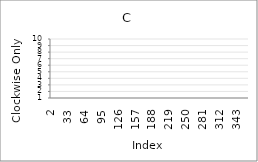
| Category | Series 0 |
|---|---|
| 2.0 | 8 |
| 3.0 | 9 |
| 4.0 | 3 |
| 5.0 | 1 |
| 6.0 | 8 |
| 7.0 | 2 |
| 8.0 | 6 |
| 9.0 | 10 |
| 10.0 | 2 |
| 11.0 | 10 |
| 12.0 | 4 |
| 13.0 | 10 |
| 14.0 | 4 |
| 15.0 | 3 |
| 16.0 | 5 |
| 17.0 | 3 |
| 18.0 | 6 |
| 19.0 | 7 |
| 20.0 | 1 |
| 21.0 | 4 |
| 22.0 | 10 |
| 23.0 | 10 |
| 24.0 | 4 |
| 25.0 | 8 |
| 26.0 | 7 |
| 27.0 | 1 |
| 28.0 | 8 |
| 29.0 | 7 |
| 30.0 | 8 |
| 31.0 | 99 |
| 32.0 | 99 |
| 33.0 | 99 |
| 34.0 | 99 |
| 35.0 | 99 |
| 36.0 | 99 |
| 37.0 | 99 |
| 38.0 | 99 |
| 39.0 | 99 |
| 40.0 | 99 |
| 41.0 | 99 |
| 42.0 | 99 |
| 43.0 | 99 |
| 44.0 | 99 |
| 45.0 | 99 |
| 46.0 | 99 |
| 47.0 | 99 |
| 48.0 | 99 |
| 49.0 | 99 |
| 50.0 | 99 |
| 51.0 | 99 |
| 52.0 | 99 |
| 53.0 | 99 |
| 54.0 | 99 |
| 55.0 | 99 |
| 56.0 | 99 |
| 57.0 | 99 |
| 58.0 | 99 |
| 59.0 | 99 |
| 60.0 | 99 |
| 61.0 | 99 |
| 62.0 | 99 |
| 63.0 | 99 |
| 64.0 | 99 |
| 65.0 | 99 |
| 66.0 | 99 |
| 67.0 | 99 |
| 68.0 | 99 |
| 69.0 | 99 |
| 70.0 | 99 |
| 71.0 | 99 |
| 72.0 | 99 |
| 73.0 | 99 |
| 74.0 | 99 |
| 75.0 | 99 |
| 76.0 | 99 |
| 77.0 | 99 |
| 78.0 | 99 |
| 79.0 | 99 |
| 80.0 | 99 |
| 81.0 | 99 |
| 82.0 | 99 |
| 83.0 | 99 |
| 84.0 | 99 |
| 85.0 | 99 |
| 86.0 | 99 |
| 87.0 | 99 |
| 88.0 | 99 |
| 89.0 | 99 |
| 90.0 | 99 |
| 91.0 | 99 |
| 92.0 | 99 |
| 93.0 | 99 |
| 94.0 | 99 |
| 95.0 | 99 |
| 96.0 | 99 |
| 97.0 | 99 |
| 98.0 | 99 |
| 99.0 | 99 |
| 100.0 | 99 |
| 101.0 | 99 |
| 102.0 | 99 |
| 103.0 | 99 |
| 104.0 | 99 |
| 105.0 | 99 |
| 106.0 | 99 |
| 107.0 | 99 |
| 108.0 | 99 |
| 109.0 | 99 |
| 110.0 | 99 |
| 111.0 | 99 |
| 112.0 | 99 |
| 113.0 | 99 |
| 114.0 | 99 |
| 115.0 | 99 |
| 116.0 | 99 |
| 117.0 | 99 |
| 118.0 | 99 |
| 119.0 | 99 |
| 120.0 | 99 |
| 121.0 | 99 |
| 122.0 | 99 |
| 123.0 | 99 |
| 124.0 | 99 |
| 125.0 | 99 |
| 126.0 | 99 |
| 127.0 | 99 |
| 128.0 | 99 |
| 129.0 | 99 |
| 130.0 | 99 |
| 131.0 | 99 |
| 132.0 | 99 |
| 133.0 | 99 |
| 134.0 | 99 |
| 135.0 | 99 |
| 136.0 | 99 |
| 137.0 | 99 |
| 138.0 | 99 |
| 139.0 | 99 |
| 140.0 | 99 |
| 141.0 | 99 |
| 142.0 | 99 |
| 143.0 | 99 |
| 144.0 | 99 |
| 145.0 | 99 |
| 146.0 | 99 |
| 147.0 | 99 |
| 148.0 | 99 |
| 149.0 | 99 |
| 150.0 | 99 |
| 151.0 | 99 |
| 152.0 | 99 |
| 153.0 | 99 |
| 154.0 | 99 |
| 155.0 | 99 |
| 156.0 | 99 |
| 157.0 | 99 |
| 158.0 | 99 |
| 159.0 | 99 |
| 160.0 | 99 |
| 161.0 | 99 |
| 162.0 | 99 |
| 163.0 | 99 |
| 164.0 | 99 |
| 165.0 | 99 |
| 166.0 | 99 |
| 167.0 | 99 |
| 168.0 | 99 |
| 169.0 | 99 |
| 170.0 | 99 |
| 171.0 | 99 |
| 172.0 | 99 |
| 173.0 | 99 |
| 174.0 | 99 |
| 175.0 | 99 |
| 176.0 | 99 |
| 177.0 | 99 |
| 178.0 | 99 |
| 179.0 | 99 |
| 180.0 | 99 |
| 181.0 | 99 |
| 182.0 | 99 |
| 183.0 | 99 |
| 184.0 | 99 |
| 185.0 | 99 |
| 186.0 | 99 |
| 187.0 | 99 |
| 188.0 | 99 |
| 189.0 | 99 |
| 190.0 | 99 |
| 191.0 | 99 |
| 192.0 | 99 |
| 193.0 | 99 |
| 194.0 | 99 |
| 195.0 | 99 |
| 196.0 | 99 |
| 197.0 | 99 |
| 198.0 | 99 |
| 199.0 | 99 |
| 200.0 | 99 |
| 201.0 | 99 |
| 202.0 | 99 |
| 203.0 | 99 |
| 204.0 | 99 |
| 205.0 | 99 |
| 206.0 | 99 |
| 207.0 | 99 |
| 208.0 | 99 |
| 209.0 | 99 |
| 210.0 | 99 |
| 211.0 | 99 |
| 212.0 | 99 |
| 213.0 | 99 |
| 214.0 | 99 |
| 215.0 | 99 |
| 216.0 | 99 |
| 217.0 | 99 |
| 218.0 | 99 |
| 219.0 | 99 |
| 220.0 | 99 |
| 221.0 | 99 |
| 222.0 | 99 |
| 223.0 | 99 |
| 224.0 | 99 |
| 225.0 | 99 |
| 226.0 | 99 |
| 227.0 | 99 |
| 228.0 | 99 |
| 229.0 | 99 |
| 230.0 | 99 |
| 231.0 | 99 |
| 232.0 | 99 |
| 233.0 | 99 |
| 234.0 | 99 |
| 235.0 | 99 |
| 236.0 | 99 |
| 237.0 | 99 |
| 238.0 | 99 |
| 239.0 | 99 |
| 240.0 | 99 |
| 241.0 | 99 |
| 242.0 | 99 |
| 243.0 | 99 |
| 244.0 | 99 |
| 245.0 | 99 |
| 246.0 | 99 |
| 247.0 | 99 |
| 248.0 | 99 |
| 249.0 | 99 |
| 250.0 | 99 |
| 251.0 | 99 |
| 252.0 | 99 |
| 253.0 | 99 |
| 254.0 | 99 |
| 255.0 | 99 |
| 256.0 | 99 |
| 257.0 | 99 |
| 258.0 | 99 |
| 259.0 | 99 |
| 260.0 | 99 |
| 261.0 | 99 |
| 262.0 | 99 |
| 263.0 | 99 |
| 264.0 | 99 |
| 265.0 | 99 |
| 266.0 | 99 |
| 267.0 | 99 |
| 268.0 | 99 |
| 269.0 | 99 |
| 270.0 | 99 |
| 271.0 | 99 |
| 272.0 | 99 |
| 273.0 | 99 |
| 274.0 | 99 |
| 275.0 | 99 |
| 276.0 | 99 |
| 277.0 | 99 |
| 278.0 | 99 |
| 279.0 | 99 |
| 280.0 | 99 |
| 281.0 | 99 |
| 282.0 | 99 |
| 283.0 | 99 |
| 284.0 | 99 |
| 285.0 | 99 |
| 286.0 | 99 |
| 287.0 | 99 |
| 288.0 | 99 |
| 289.0 | 99 |
| 290.0 | 99 |
| 291.0 | 99 |
| 292.0 | 99 |
| 293.0 | 99 |
| 294.0 | 99 |
| 295.0 | 99 |
| 296.0 | 99 |
| 297.0 | 99 |
| 298.0 | 99 |
| 299.0 | 99 |
| 300.0 | 99 |
| 301.0 | 99 |
| 302.0 | 99 |
| 303.0 | 99 |
| 304.0 | 99 |
| 305.0 | 99 |
| 306.0 | 99 |
| 307.0 | 99 |
| 308.0 | 99 |
| 309.0 | 99 |
| 310.0 | 99 |
| 311.0 | 99 |
| 312.0 | 99 |
| 313.0 | 99 |
| 314.0 | 99 |
| 315.0 | 99 |
| 316.0 | 99 |
| 317.0 | 99 |
| 318.0 | 99 |
| 319.0 | 99 |
| 320.0 | 99 |
| 321.0 | 99 |
| 322.0 | 99 |
| 323.0 | 99 |
| 324.0 | 99 |
| 325.0 | 99 |
| 326.0 | 99 |
| 327.0 | 99 |
| 328.0 | 99 |
| 329.0 | 99 |
| 330.0 | 99 |
| 331.0 | 99 |
| 332.0 | 99 |
| 333.0 | 99 |
| 334.0 | 99 |
| 335.0 | 99 |
| 336.0 | 99 |
| 337.0 | 99 |
| 338.0 | 99 |
| 339.0 | 99 |
| 340.0 | 99 |
| 341.0 | 99 |
| 342.0 | 99 |
| 343.0 | 99 |
| 344.0 | 99 |
| 345.0 | 99 |
| 346.0 | 99 |
| 347.0 | 99 |
| 348.0 | 99 |
| 349.0 | 99 |
| 350.0 | 99 |
| 351.0 | 99 |
| 352.0 | 99 |
| 353.0 | 99 |
| 354.0 | 99 |
| 355.0 | 99 |
| 356.0 | 99 |
| 357.0 | 99 |
| 358.0 | 99 |
| 359.0 | 99 |
| 360.0 | 99 |
| 361.0 | 99 |
| 362.0 | 99 |
| 363.0 | 99 |
| 364.0 | 99 |
| 365.0 | 99 |